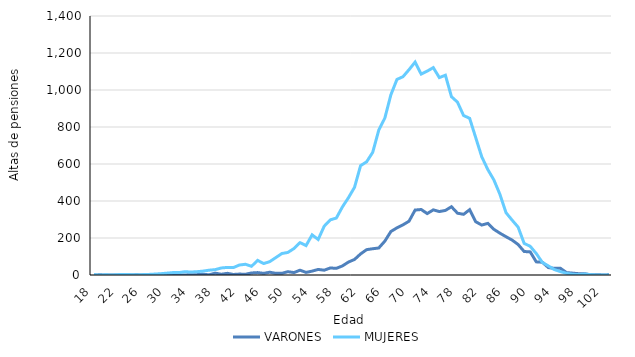
| Category | VARONES | MUJERES |
|---|---|---|
| 18.0 | 0 | 1 |
| 19.0 | 1 | 0 |
| 20.0 | 0 | 1 |
| 21.0 | 0 | 0 |
| 22.0 | 0 | 2 |
| 23.0 | 0 | 3 |
| 24.0 | 0 | 2 |
| 25.0 | 1 | 1 |
| 26.0 | 0 | 2 |
| 27.0 | 0 | 3 |
| 28.0 | 0 | 5 |
| 29.0 | 1 | 7 |
| 30.0 | 3 | 10 |
| 31.0 | 1 | 13 |
| 32.0 | 1 | 13 |
| 33.0 | 0 | 18 |
| 34.0 | 2 | 16 |
| 35.0 | 2 | 18 |
| 36.0 | 4 | 21 |
| 37.0 | 1 | 26 |
| 38.0 | 10 | 29 |
| 39.0 | 4 | 38 |
| 40.0 | 9 | 41 |
| 41.0 | 3 | 40 |
| 42.0 | 5 | 54 |
| 43.0 | 4 | 58 |
| 44.0 | 11 | 47 |
| 45.0 | 13 | 79 |
| 46.0 | 9 | 62 |
| 47.0 | 15 | 72 |
| 48.0 | 9 | 94 |
| 49.0 | 9 | 116 |
| 50.0 | 18 | 122 |
| 51.0 | 13 | 143 |
| 52.0 | 26 | 175 |
| 53.0 | 14 | 159 |
| 54.0 | 21 | 217 |
| 55.0 | 30 | 192 |
| 56.0 | 26 | 264 |
| 57.0 | 38 | 298 |
| 58.0 | 36 | 308 |
| 59.0 | 49 | 368 |
| 60.0 | 70 | 418 |
| 61.0 | 84 | 474 |
| 62.0 | 114 | 591 |
| 63.0 | 137 | 612 |
| 64.0 | 142 | 663 |
| 65.0 | 146 | 783 |
| 66.0 | 183 | 848 |
| 67.0 | 235 | 974 |
| 68.0 | 255 | 1057 |
| 69.0 | 271 | 1072 |
| 70.0 | 291 | 1110 |
| 71.0 | 351 | 1151 |
| 72.0 | 354 | 1086 |
| 73.0 | 332 | 1102 |
| 74.0 | 352 | 1121 |
| 75.0 | 343 | 1067 |
| 76.0 | 349 | 1080 |
| 77.0 | 369 | 964 |
| 78.0 | 334 | 934 |
| 79.0 | 328 | 862 |
| 80.0 | 353 | 847 |
| 81.0 | 288 | 743 |
| 82.0 | 270 | 639 |
| 83.0 | 279 | 570 |
| 84.0 | 247 | 514 |
| 85.0 | 226 | 436 |
| 86.0 | 207 | 337 |
| 87.0 | 189 | 297 |
| 88.0 | 165 | 259 |
| 89.0 | 127 | 171 |
| 90.0 | 125 | 155 |
| 91.0 | 71 | 116 |
| 92.0 | 69 | 68 |
| 93.0 | 40 | 49 |
| 94.0 | 36 | 29 |
| 95.0 | 36 | 18 |
| 96.0 | 13 | 9 |
| 97.0 | 10 | 4 |
| 98.0 | 7 | 2 |
| 99.0 | 7 | 5 |
| 100.0 | 1 | 2 |
| 101.0 | 2 | 0 |
| 102.0 | 0 | 0 |
| 103.0 | 1 | 0 |